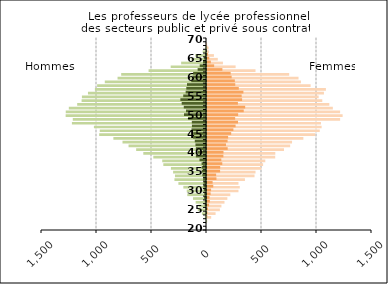
| Category | Femmes public | Femmes privé |
|---|---|---|
| 20.0 | 0 | 0 |
| 21.0 | 0 | 0 |
| 22.0 | 2 | 0 |
| 23.0 | 38 | 3 |
| 24.0 | 78 | 4 |
| 25.0 | 117 | 9 |
| 26.0 | 131 | 19 |
| 27.0 | 159 | 26 |
| 28.0 | 185 | 23 |
| 29.0 | 212 | 33 |
| 30.0 | 286 | 37 |
| 31.0 | 298 | 57 |
| 32.0 | 286 | 51 |
| 33.0 | 345 | 86 |
| 34.0 | 432 | 83 |
| 35.0 | 441 | 119 |
| 36.0 | 494 | 120 |
| 37.0 | 510 | 139 |
| 38.0 | 530 | 130 |
| 39.0 | 620 | 149 |
| 40.0 | 621 | 150 |
| 41.0 | 700 | 188 |
| 42.0 | 756 | 173 |
| 43.0 | 773 | 187 |
| 44.0 | 876 | 192 |
| 45.0 | 984 | 220 |
| 46.0 | 1025 | 240 |
| 47.0 | 1042 | 260 |
| 48.0 | 1036 | 282 |
| 49.0 | 1210 | 256 |
| 50.0 | 1233 | 283 |
| 51.0 | 1210 | 334 |
| 52.0 | 1144 | 347 |
| 53.0 | 1112 | 281 |
| 54.0 | 1048 | 319 |
| 55.0 | 1015 | 315 |
| 56.0 | 1063 | 331 |
| 57.0 | 1081 | 289 |
| 58.0 | 942 | 257 |
| 59.0 | 854 | 253 |
| 60.0 | 832 | 224 |
| 61.0 | 747 | 215 |
| 62.0 | 441 | 140 |
| 63.0 | 260 | 65 |
| 64.0 | 145 | 35 |
| 65.0 | 98 | 21 |
| 66.0 | 63 | 10 |
| 67.0 | 19 | 1 |
| 68.0 | 15 | 2 |
| 69.0 | 1 | 0 |
| 70.0 | 0 | 0 |